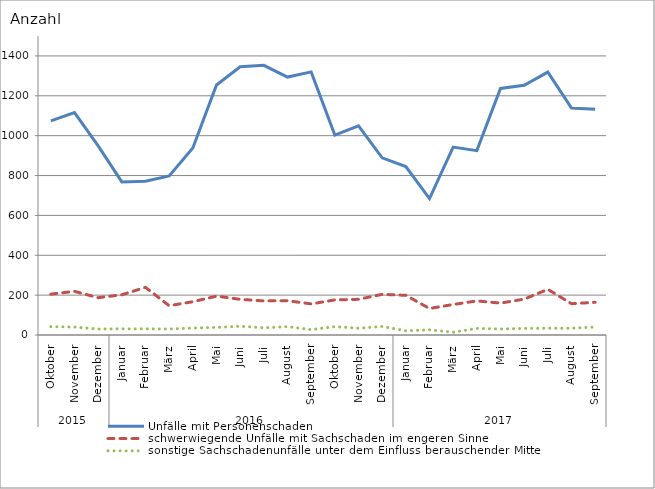
| Category | Unfälle mit Personenschaden | schwerwiegende Unfälle mit Sachschaden im engeren Sinne | sonstige Sachschadenunfälle unter dem Einfluss berauschender Mittel |
|---|---|---|---|
| 0 | 1074 | 205 | 42 |
| 1 | 1116 | 219 | 40 |
| 2 | 949 | 187 | 30 |
| 3 | 768 | 202 | 31 |
| 4 | 771 | 239 | 31 |
| 5 | 798 | 147 | 30 |
| 6 | 938 | 167 | 35 |
| 7 | 1254 | 195 | 38 |
| 8 | 1346 | 179 | 44 |
| 9 | 1353 | 171 | 36 |
| 10 | 1294 | 172 | 42 |
| 11 | 1320 | 156 | 27 |
| 12 | 1003 | 176 | 42 |
| 13 | 1049 | 179 | 34 |
| 14 | 889 | 204 | 43 |
| 15 | 845 | 199 | 21 |
| 16 | 684 | 133 | 26 |
| 17 | 943 | 153 | 14 |
| 18 | 925 | 171 | 33 |
| 19 | 1237 | 160 | 30 |
| 20 | 1253 | 180 | 33 |
| 21 | 1319 | 229 | 34 |
| 22 | 1139 | 157 | 34 |
| 23 | 1133 | 164 | 40 |